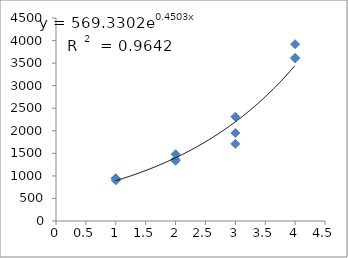
| Category | Series 0 |
|---|---|
| 1.0 | 946 |
| 1.0 | 900 |
| 1.0 | 944 |
| 2.0 | 1480 |
| 2.0 | 1365 |
| 2.0 | 1335 |
| 3.0 | 1710 |
| 3.0 | 1950 |
| 3.0 | 2310 |
| 4.0 | 3610 |
| 4.0 | 3920 |
| 4.0 | 3615 |